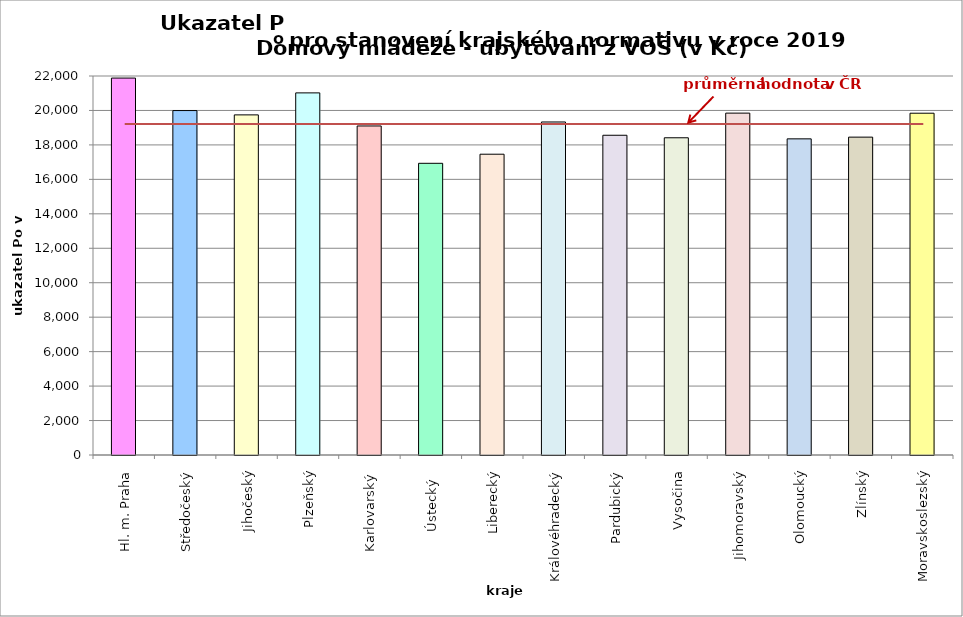
| Category | Series 0 |
|---|---|
| Hl. m. Praha | 21880 |
| Středočeský | 19994 |
| Jihočeský | 19743 |
| Plzeňský | 21020 |
| Karlovarský  | 19100 |
| Ústecký   | 16932 |
| Liberecký | 17460 |
| Královéhradecký | 19331 |
| Pardubický | 18560 |
| Vysočina | 18414 |
| Jihomoravský | 19845 |
| Olomoucký | 18352 |
| Zlínský | 18451 |
| Moravskoslezský | 19840 |